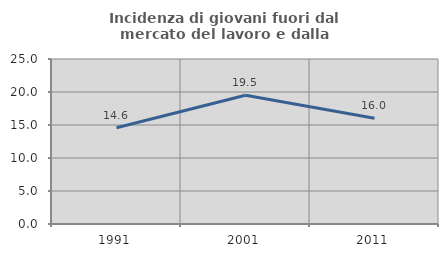
| Category | Incidenza di giovani fuori dal mercato del lavoro e dalla formazione  |
|---|---|
| 1991.0 | 14.595 |
| 2001.0 | 19.503 |
| 2011.0 | 16.038 |